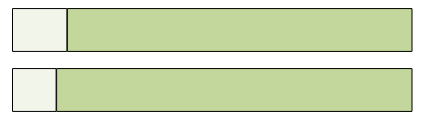
| Category | Series 0 | Series 1 |
|---|---|---|
| 0 | 150337 | 1212923 |
| 1 | 218765 | 1376162 |